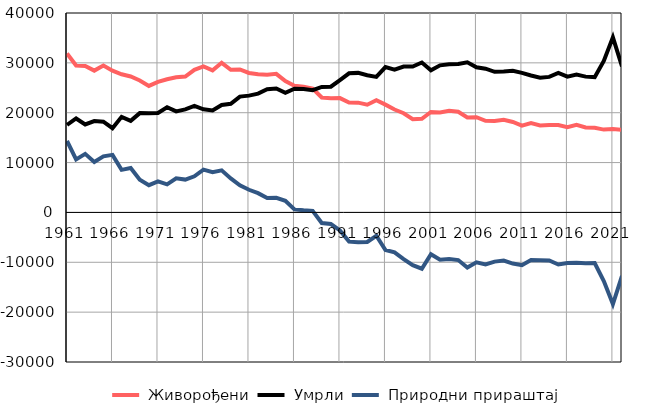
| Category |  Живорођени |  Умрли |  Природни прираштај |
|---|---|---|---|
| 1961.0 | 31888 | 17540 | 14348 |
| 1962.0 | 29477 | 18841 | 10636 |
| 1963.0 | 29392 | 17644 | 11748 |
| 1964.0 | 28444 | 18313 | 10131 |
| 1965.0 | 29453 | 18204 | 11249 |
| 1966.0 | 28439 | 16890 | 11549 |
| 1967.0 | 27711 | 19170 | 8541 |
| 1968.0 | 27269 | 18368 | 8901 |
| 1969.0 | 26479 | 19921 | 6558 |
| 1970.0 | 25380 | 19916 | 5464 |
| 1971.0 | 26170 | 19946 | 6224 |
| 1972.0 | 26715 | 21089 | 5626 |
| 1973.0 | 27094 | 20260 | 6834 |
| 1974.0 | 27253 | 20666 | 6587 |
| 1975.0 | 28595 | 21356 | 7239 |
| 1976.0 | 29273 | 20680 | 8593 |
| 1977.0 | 28490 | 20437 | 8053 |
| 1978.0 | 30007 | 21559 | 8448 |
| 1979.0 | 28610 | 21783 | 6827 |
| 1980.0 | 28681 | 23227 | 5454 |
| 1981.0 | 27971 | 23425 | 4546 |
| 1982.0 | 27703 | 23828 | 3875 |
| 1983.0 | 27624 | 24709 | 2915 |
| 1984.0 | 27791 | 24864 | 2927 |
| 1985.0 | 26331 | 23985 | 2346 |
| 1986.0 | 25422 | 24821 | 601 |
| 1987.0 | 25203 | 24775 | 428 |
| 1988.0 | 24848 | 24533 | 315 |
| 1989.0 | 23047 | 25175 | -2128 |
| 1990.0 | 22900 | 25228 | -2328 |
| 1991.0 | 22935 | 26549 | -3614 |
| 1992.0 | 22049 | 27906 | -5857 |
| 1993.0 | 22018 | 27990 | -5972 |
| 1994.0 | 21595 | 27518 | -5923 |
| 1995.0 | 22499 | 27177 | -4678 |
| 1996.0 | 21624 | 29152 | -7528 |
| 1997.0 | 20645 | 28646 | -8001 |
| 1998.0 | 19894 | 29251 | -9357 |
| 1999.0 | 18686 | 29271 | -10585 |
| 2000.0 | 18792 | 30076 | -11284 |
| 2001.0 | 20145 | 28517 | -8372 |
| 2002.0 | 20030 | 29506 | -9476 |
| 2003.0 | 20381 | 29741 | -9360 |
| 2004.0 | 20206 | 29764 | -9558 |
| 2005.0 | 19058 | 30124 | -11066 |
| 2006.0 | 19102 | 29114 | -10012 |
| 2007.0 | 18380 | 28825 | -10445 |
| 2008.0 | 18339 | 28200 | -9861 |
| 2009.0 | 18590 | 28252 | -9662 |
| 2010.0 | 18145 | 28399 | -10254 |
| 2011.0 | 17410 | 27999 | -10589 |
| 2012.0 | 17932 | 27470 | -9538 |
| 2013.0 | 17439 | 27035 | -9596 |
| 2014.0 | 17535 | 27183 | -9648 |
| 2015.0 | 17533 | 27983 | -10450 |
| 2016.0 | 17107 | 27234 | -10127 |
| 2017.0 | 17564 | 27634 | -10070 |
| 2018.0 | 17027 | 27239 | -10212 |
| 2019.0 | 16985 | 27141 | -10156 |
| 2020.0 | 16613 | 30394 | -13781 |
| 2021.0 | 16737 | 35126 | -18389 |
| 2022.0 | 16564 | 29302 | -12738 |